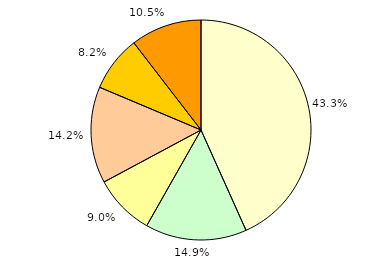
| Category | Series 0 |
|---|---|
| unter 3 Jahre | 58 |
| 3 bis unter 6 Jahre | 20 |
| 6 bis unter 9 Jahre | 12 |
| 9 bis unter 12 Jahre | 19 |
| 12 bis unter 15 Jahre | 11 |
| 15 bis unter 18 Jahre | 14 |